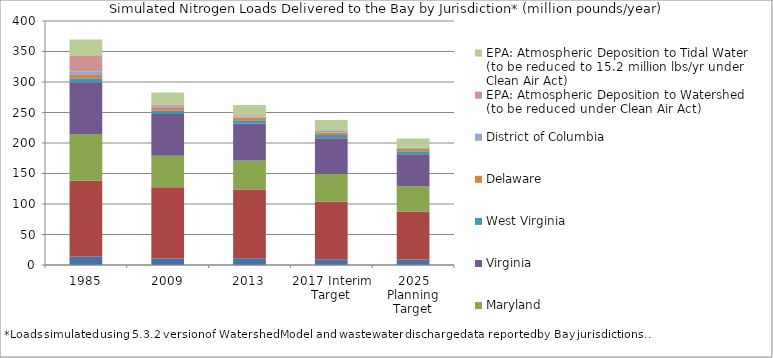
| Category | New York  | Pennsylvania  | Maryland  | Virginia  | West Virginia  | Delaware  | District of Columbia  | EPA: Atmospheric Deposition to Watershed (to be reduced under Clean Air Act) | EPA: Atmospheric Deposition to Tidal Water (to be reduced to 15.2 million lbs/yr under Clean Air Act) |
|---|---|---|---|---|---|---|---|---|---|
| 1985 | 13.914 | 124.277 | 76.561 | 85.028 | 6.367 | 5.267 | 6.171 | 26.117 | 26.08 |
| 2009 | 10.719 | 116.636 | 51.948 | 68.128 | 5.465 | 4.474 | 2.877 | 3.047 | 19.368 |
| 2013 | 10.905 | 112.71 | 47.569 | 60.86 | 5.247 | 4.518 | 1.775 | 1.897 | 16.899 |
| 2017 Interim Target | 9.598 | 94.052 | 45.481 | 58.804 | 5.2 | 3.824 | 2.575 | 1.219 | 16.855 |
| 2025 Planning Target | 8.85 | 78.996 | 41.17 | 52.588 | 5.023 | 3.391 | 2.373 | 0 | 15.18 |